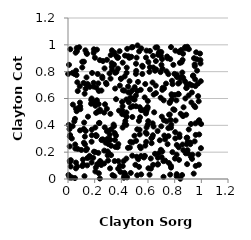
| Category | Series 0 |
|---|---|
| 0.046676937674423886 | 0.784 |
| 0.1731907339990109 | 0.561 |
| 0.23156018715488924 | 0.043 |
| 0.42760766730506783 | 0.92 |
| 0.5336893021140406 | 0.952 |
| 0.09268886672519401 | 0.521 |
| 0.6367927705438385 | 0.326 |
| 0.9290513467448243 | 0.645 |
| 0.5379660975195389 | 0.535 |
| 0.7785230968841657 | 0.594 |
| 0.4707104948257748 | 0.535 |
| 0.7468949703240096 | 0.26 |
| 0.8391897326390824 | 0.866 |
| 0.34968576601538326 | 0.134 |
| 0.6953053178982544 | 0.606 |
| 0.2968760122465636 | 0.205 |
| 0.5696426322543541 | 0.169 |
| 0.6722983463575628 | 0.108 |
| 0.41036892436965217 | 0.867 |
| 0.5864340884211007 | 0.276 |
| 0.4175408332572171 | 0.133 |
| 0.5846683655671804 | 0.905 |
| 0.8909354414835754 | 0.259 |
| 0.013335728364849 | 0.135 |
| 0.11955547361146536 | 0.874 |
| 0.7665870626792595 | 0.033 |
| 0.6250503684640436 | 0.303 |
| 0.1328308287717144 | 0.358 |
| 0.09125341376203373 | 0.542 |
| 0.519206114093471 | 0.37 |
| 0.5092706347199005 | 0.784 |
| 0.2057818210240638 | 0.546 |
| 0.917273317381685 | 0.259 |
| 0.08429098524658475 | 0.982 |
| 0.5367592920172873 | 0.367 |
| 0.37214312046848014 | 0.237 |
| 0.32955264627195086 | 0.959 |
| 0.4754985411567399 | 0.911 |
| 0.6524488144445785 | 0.188 |
| 0.08940384945948819 | 0.57 |
| 0.06554562086051482 | 0.976 |
| 0.7155857116474972 | 0.133 |
| 0.5565957550004644 | 0.844 |
| 0.07018524425496449 | 0.094 |
| 0.7394409686287119 | 0.43 |
| 0.8590399694918804 | 0.257 |
| 0.057574957408292556 | 0.941 |
| 0.1640557005931702 | 0.687 |
| 0.8646857087342421 | 0.472 |
| 0.597121755670744 | 0.537 |
| 0.22286788275097186 | 0.783 |
| 0.8962677892962819 | 0.215 |
| 0.05966879743334477 | 0.123 |
| 0.8829805018857326 | 0.192 |
| 0.4433115345549993 | 0.012 |
| 0.7727190102088954 | 0.085 |
| 0.5390898360487064 | 0.242 |
| 0.877691282450784 | 0.728 |
| 0.06703394839677779 | 0.953 |
| 0.6721994752635393 | 0.357 |
| 0.2846353952011683 | 0.716 |
| 0.3286666740754009 | 0.836 |
| 0.9331424568217861 | 0.181 |
| 0.25059040371349994 | 0.659 |
| 0.16177745395152135 | 0.172 |
| 0.14742301760385748 | 0.708 |
| 0.8595227222581635 | 0.888 |
| 0.3744627109753005 | 0.823 |
| 0.19228619816168752 | 0.94 |
| 0.2237660073145369 | 0.501 |
| 0.5092260927614612 | 0.622 |
| 0.7224204070046648 | 0.324 |
| 0.19194597458374296 | 0.688 |
| 0.2569839202288496 | 0.763 |
| 0.4314366114576344 | 0.475 |
| 0.0547269025426534 | 0.227 |
| 0.509920508866802 | 0.542 |
| 0.9805405721133529 | 0.427 |
| 0.8153659750011059 | 0.036 |
| 0.6747229036105801 | 0.11 |
| 0.4223224963584687 | 0.025 |
| 0.8628799058367227 | 0.933 |
| 0.8327770680637624 | 0.143 |
| 0.6208491824398406 | 0.153 |
| 0.5112553337236531 | 0.284 |
| 0.1950958757126044 | 0.204 |
| 0.3544520413392117 | 0.792 |
| 0.9212706771769078 | 0.167 |
| 0.3020972747949281 | 0.261 |
| 0.8375365185972018 | 0.951 |
| 0.052238632556893504 | 0.007 |
| 0.8130604562920429 | 0.586 |
| 0.9370957154208669 | 0.768 |
| 0.19401418803622206 | 0.967 |
| 0.9499446730407738 | 0.281 |
| 0.9395151472527965 | 0.772 |
| 0.036636022783196574 | 0.554 |
| 0.9255698461596198 | 0.57 |
| 0.7634444239329383 | 0.48 |
| 0.4866858603612687 | 0.542 |
| 0.38935800254068825 | 0.097 |
| 0.4557319380780795 | 0.572 |
| 0.24084133738431882 | 0.134 |
| 0.4056241756335786 | 0.574 |
| 0.7072956053577886 | 0.664 |
| 0.17869045569367317 | 0.326 |
| 0.2168766772427906 | 0.964 |
| 0.4097821111222963 | 0.383 |
| 0.4984210118251923 | 0.322 |
| 0.8934281752644695 | 0.111 |
| 0.7985944220098996 | 0.515 |
| 0.43978977307100736 | 0.463 |
| 0.23875659458211201 | 0.886 |
| 0.5146095974420601 | 0.904 |
| 0.752792451541724 | 0.781 |
| 0.20892436236240533 | 0.327 |
| 0.3156066523986101 | 0.079 |
| 0.8156582640601323 | 0.778 |
| 0.1773685117092146 | 0.123 |
| 0.3931472308274868 | 0.053 |
| 0.01286693904584747 | 0.243 |
| 0.6878301164890219 | 0.949 |
| 0.9302752011022033 | 0.15 |
| 0.597187901010962 | 0.403 |
| 0.32052714300663593 | 0.924 |
| 0.2168477848707807 | 0.587 |
| 0.38875025675613023 | 0.696 |
| 0.01736045135898978 | 0.967 |
| 0.8976954201139312 | 0.277 |
| 0.30467689092527306 | 0.36 |
| 0.9838768596884649 | 0.332 |
| 0.7998085724246662 | 0.626 |
| 0.4377117583783472 | 0.152 |
| 0.20186721276086267 | 0.904 |
| 0.8308493931554167 | 0.236 |
| 0.7084889299643606 | 0.822 |
| 0.6994989402984891 | 0.392 |
| 0.23003936401347205 | 0.558 |
| 0.5799627387163104 | 0.515 |
| 0.589466531291116 | 0.518 |
| 0.9785981418582956 | 0.43 |
| 0.6147685263011925 | 0.667 |
| 0.3828943100506701 | 0.509 |
| 0.23957370365303335 | 0.505 |
| 0.5819730832315049 | 0.347 |
| 0.0471722198335955 | 0.43 |
| 0.9747172168335393 | 0.711 |
| 0.4851650287341322 | 0.273 |
| 0.2090150252280079 | 0.086 |
| 0.29189423171228585 | 0.356 |
| 0.7727391313128991 | 0.383 |
| 0.14242598938925052 | 0.225 |
| 0.942835989518905 | 0.04 |
| 0.5403230809583446 | 0.46 |
| 0.4681067112876465 | 0.277 |
| 0.8515045136892441 | 0.87 |
| 0.6463657964301295 | 0.497 |
| 0.23893202538417474 | 0.004 |
| 0.49045672037080884 | 0.601 |
| 0.3706067786411054 | 0.904 |
| 0.011603717096283836 | 0.011 |
| 0.13044044634643015 | 0.959 |
| 0.7741159163835692 | 0.405 |
| 0.7351591692281364 | 0.711 |
| 0.8995198972721726 | 0.193 |
| 0.2196414838713818 | 0.111 |
| 0.059234877027061233 | 0.525 |
| 0.5572932057896541 | 0.783 |
| 0.9817779440189164 | 0.106 |
| 0.27404348837066406 | 0.824 |
| 0.6528094300983222 | 0.807 |
| 0.11687470963969998 | 0.716 |
| 0.28181051340614854 | 0.271 |
| 0.7568397486729 | 0.119 |
| 0.520176294162281 | 0.656 |
| 0.5795129214809566 | 0.708 |
| 0.021428901937924915 | 0.14 |
| 0.38695176546716287 | 0.953 |
| 0.49946462558968147 | 0.591 |
| 0.6014732816024693 | 0.431 |
| 0.2712519921636725 | 0.495 |
| 0.13853399145398415 | 0.939 |
| 0.8556199636965999 | 0.03 |
| 0.8344403950042217 | 0.946 |
| 0.7901646861157391 | 0.851 |
| 0.752416801457777 | 0.379 |
| 0.16144195128851072 | 0.161 |
| 0.028684990321949867 | 0.302 |
| 0.9681500463335102 | 0.808 |
| 0.5454567520497118 | 0.665 |
| 0.18899549003778846 | 0.157 |
| 0.32327126791351357 | 0.248 |
| 0.5901798876041708 | 0.337 |
| 0.12360925044257637 | 0.021 |
| 0.8941179046650222 | 0.308 |
| 0.8454051927353424 | 0.486 |
| 0.3110599835457872 | 0.294 |
| 0.46474136235282115 | 0.906 |
| 0.7666994723166691 | 0.894 |
| 0.47757962831922895 | 0.981 |
| 0.5964522816426117 | 0.526 |
| 0.3230929309330791 | 0.178 |
| 0.4404803323994665 | 0.83 |
| 0.5375475191852845 | 0.332 |
| 0.33392427875408065 | 0.029 |
| 0.24889701971087067 | 0.104 |
| 0.0010635826426977852 | 0.783 |
| 0.30048827100565284 | 0.137 |
| 0.6770147875417601 | 0.925 |
| 0.3603756276541707 | 0.595 |
| 0.8147388297407242 | 0.021 |
| 0.5250355212838486 | 0.724 |
| 0.584997234121754 | 0.521 |
| 0.7282032309949886 | 0.296 |
| 0.46795644756283933 | 0.607 |
| 0.39663160583756957 | 0.748 |
| 0.004017448057230958 | 0.031 |
| 0.034287747404613475 | 0.791 |
| 0.6318326608256549 | 0.311 |
| 0.6793232202820944 | 0.19 |
| 0.6219023781600583 | 0.078 |
| 0.40665322084471983 | 0.483 |
| 0.4301725525817708 | 0.432 |
| 0.005926100241357826 | 0.403 |
| 0.18058778471610612 | 0.79 |
| 0.4849873381048481 | 0.983 |
| 0.17822526094861293 | 0.368 |
| 0.23142157496354893 | 0.656 |
| 0.1388701952417476 | 0.757 |
| 0.7532573207696533 | 0.32 |
| 0.7839074247458218 | 0.707 |
| 0.6117314428070794 | 0.032 |
| 0.05228154762342658 | 0.448 |
| 0.33103349226327805 | 0.814 |
| 0.27751942156855225 | 0.557 |
| 0.4826434473045821 | 0.462 |
| 0.7292939424367355 | 0.137 |
| 0.7718510145786598 | 0.098 |
| 0.7009824638826786 | 0.851 |
| 0.6997395988194663 | 0.946 |
| 0.5458758141814352 | 0.23 |
| 0.42218435398407644 | 0.659 |
| 0.5326873376344007 | 0.091 |
| 0.20104690119422503 | 0.559 |
| 0.22739539564156597 | 0.194 |
| 0.11404873586985102 | 0.11 |
| 0.6966209705767614 | 0.218 |
| 0.2536996646733097 | 0.294 |
| 0.029349135643793933 | 0.011 |
| 0.4191301906429188 | 0.01 |
| 0.6965018484824774 | 0.918 |
| 0.261613111439334 | 0.295 |
| 0.09031626180511935 | 0.362 |
| 0.8617144096504336 | 0.469 |
| 0.6623028654885308 | 0.816 |
| 0.8047026871852438 | 0.303 |
| 0.5795040314999311 | 0.249 |
| 0.9509197089460705 | 0.841 |
| 0.9116271095676838 | 0.708 |
| 0.7653796191227267 | 0.575 |
| 0.7982351386778459 | 0.783 |
| 0.6567747601375253 | 0.98 |
| 0.7763192005087426 | 0.631 |
| 0.360275278710591 | 0.324 |
| 0.5267040356092753 | 0.147 |
| 0.12472536284638086 | 0.636 |
| 0.3178613780326637 | 0.486 |
| 0.034895528340997774 | 0.393 |
| 0.9541997551984307 | 0.536 |
| 0.26219415900358123 | 0.879 |
| 0.9759566808740957 | 0.618 |
| 0.06406409400634035 | 0.774 |
| 0.702666696735508 | 0.162 |
| 0.06018690966733417 | 0.808 |
| 0.8775115392148062 | 0.983 |
| 0.2753304862945135 | 0.385 |
| 0.17473535762787337 | 0.589 |
| 0.3279488693203214 | 0.864 |
| 0.6143881808407408 | 0.954 |
| 0.3113338534782187 | 0.786 |
| 0.22482096264188062 | 0.11 |
| 0.8650165731351144 | 0.215 |
| 0.5116528102095552 | 0.806 |
| 0.8442961135586228 | 0.749 |
| 0.42586921903577735 | 0.41 |
| 0.14996468605418806 | 0.465 |
| 0.6348286272017003 | 0.415 |
| 0.4999931282567323 | 0.685 |
| 0.05405943608713265 | 0.257 |
| 0.9773985862411543 | 0.183 |
| 0.4707546040542924 | 0.045 |
| 0.5054530087620377 | 0.106 |
| 0.7429478002552824 | 0.913 |
| 0.23562032283682216 | 0.418 |
| 0.547349668052422 | 0.171 |
| 0.6427055654996492 | 0.629 |
| 0.6596077660288989 | 0.64 |
| 0.5489249252545415 | 0.034 |
| 0.5498278083829402 | 0.973 |
| 0.10751676692487913 | 0.096 |
| 0.762517824391527 | 0.567 |
| 0.5099286013655342 | 0.859 |
| 0.35000501313897375 | 0.343 |
| 0.8803495025709801 | 0.6 |
| 0.4296417057332826 | 0.035 |
| 0.17719850614638696 | 0.6 |
| 0.2920733755424991 | 0.888 |
| 0.7462450643580057 | 0.9 |
| 0.602907782331563 | 0.871 |
| 0.9929195489582779 | 0.886 |
| 0.06477872015754783 | 0.505 |
| 0.5893531135583372 | 0.384 |
| 0.4521831901090685 | 0.646 |
| 0.43695466735920246 | 0.403 |
| 0.34800778798052007 | 0.02 |
| 0.5190108359200212 | 0.028 |
| 0.21089338614616993 | 0.493 |
| 0.3535897971083259 | 0.674 |
| 0.9499482972654503 | 0.854 |
| 0.8900513913134721 | 0.307 |
| 0.20531044773496626 | 0.056 |
| 0.06988730031232145 | 0.721 |
| 0.827024461425214 | 0.635 |
| 0.5151721267317756 | 0.166 |
| 0.14492622633513338 | 0.156 |
| 0.2578332420932501 | 0.752 |
| 0.05904667961419439 | 0.08 |
| 0.610637764297836 | 0.799 |
| 0.5751061505551872 | 0.608 |
| 0.6580167238168255 | 0.696 |
| 0.4524635927805768 | 0.915 |
| 0.990369149846694 | 0.935 |
| 0.8425466244286772 | 0.002 |
| 0.4495421552162856 | 0.232 |
| 0.015900933295398826 | 0.328 |
| 0.957961263671676 | 0.329 |
| 0.3973389604751989 | 0.747 |
| 0.6378950347058552 | 0.918 |
| 0.9667757710414732 | 0.892 |
| 0.1213800841724869 | 0.421 |
| 0.0885522296969212 | 0.691 |
| 0.17695083299720848 | 0.278 |
| 0.37722946494891824 | 0.133 |
| 0.46154528586146715 | 0.729 |
| 0.7163863908999234 | 0.016 |
| 0.7204091490595579 | 0.676 |
| 0.3628780821798959 | 0.797 |
| 0.5848214861149837 | 0.488 |
| 0.945118709762319 | 0.9 |
| 0.8016530323521839 | 0.152 |
| 0.7071751713168705 | 0.205 |
| 0.20501177725771602 | 0.384 |
| 0.9834342100472789 | 0.438 |
| 0.351793660552625 | 0.291 |
| 0.7692624707880285 | 0.44 |
| 0.7197517543221705 | 0.438 |
| 0.8160482211995947 | 0.253 |
| 0.7386796991757151 | 0.802 |
| 0.01131254985869165 | 0.371 |
| 0.4640189177873881 | 0.234 |
| 0.8864602373824809 | 0.479 |
| 0.6688771296491367 | 0.981 |
| 0.7099371441382194 | 0.68 |
| 0.9577844659695542 | 0.097 |
| 0.4824444248860417 | 0.661 |
| 0.560051431718217 | 0.837 |
| 0.0733326902855516 | 0.224 |
| 0.0729282425018432 | 0.656 |
| 0.914639213226625 | 0.272 |
| 0.7582573063526906 | 0.479 |
| 0.817294212596679 | 0.76 |
| 0.5215242595917049 | 0.996 |
| 0.9057558737165539 | 0.369 |
| 0.31306145721162937 | 0.331 |
| 0.4880793085549877 | 0.597 |
| 0.20477014177567027 | 0.2 |
| 0.2084721523131198 | 0.58 |
| 0.7726117846574002 | 0.983 |
| 0.22727546776773266 | 0.713 |
| 0.013736217169282347 | 0.317 |
| 0.6807876227893973 | 0.939 |
| 0.43844322872972913 | 0.496 |
| 0.1263784011054417 | 0.316 |
| 0.2130831507313603 | 0.681 |
| 0.9969850894983238 | 0.23 |
| 0.9051153431127194 | 0.623 |
| 0.8866396800112862 | 0.678 |
| 0.6738144842029629 | 0.158 |
| 0.14237165835493618 | 0.932 |
| 0.8054398134099673 | 0.956 |
| 0.8268740951494604 | 0.711 |
| 0.3553849862873231 | 0.239 |
| 0.6885416956836965 | 0.289 |
| 0.5887692642433846 | 0.957 |
| 0.4680082834914421 | 0.645 |
| 0.291620661692459 | 0.523 |
| 0.4504296442553802 | 0.689 |
| 0.4235039693484443 | 0.046 |
| 0.014502209180590671 | 0.127 |
| 0.8068924064484292 | 0.436 |
| 0.28896192931179143 | 0.706 |
| 0.3760376444659641 | 0.905 |
| 0.8037669939467939 | 0.349 |
| 0.8491277289171141 | 0.962 |
| 0.4074433069660559 | 0.511 |
| 0.5476679919790673 | 0.513 |
| 0.9223575799900378 | 0.41 |
| 0.6339496376838221 | 0.719 |
| 0.7895772712345045 | 0.519 |
| 0.0073682798715560835 | 0.851 |
| 0.11177156094417802 | 0.145 |
| 0.6941883951354908 | 0.797 |
| 0.3178691684323005 | 0.292 |
| 0.29427532823703834 | 0.298 |
| 0.8665931970179298 | 0.534 |
| 0.9957845530235843 | 0.729 |
| 0.2321842783138936 | 0.416 |
| 0.9448269075835343 | 0.547 |
| 0.6591246140997019 | 0.879 |
| 0.4440453885580857 | 0.97 |
| 0.4249046339863435 | 0.764 |
| 0.021047927732604332 | 0.012 |
| 0.1407439789725133 | 0.702 |
| 0.5592948711447782 | 0.513 |
| 0.09979321074192071 | 0.217 |
| 0.12725986349199214 | 0.259 |
| 0.6031046184695127 | 0.08 |
| 0.239890030508761 | 0.516 |
| 0.4580795722123372 | 0.904 |
| 0.43952468403163913 | 0.792 |
| 0.1320184762354557 | 0.672 |
| 0.37739381307627096 | 0.26 |
| 0.8641691870170831 | 0.754 |
| 0.21238189883054734 | 0.32 |
| 0.7787356329675972 | 0.625 |
| 0.34539305985665936 | 0.393 |
| 0.8572487527551992 | 0.794 |
| 0.8355351632370608 | 0.333 |
| 0.11854171949387114 | 0.373 |
| 0.9983595637995429 | 0.41 |
| 0.10712872624642594 | 0.874 |
| 0.3450268428644252 | 0.853 |
| 0.9553515733923481 | 0.693 |
| 0.9802293740157771 | 0.579 |
| 0.14389767309145657 | 0.101 |
| 0.8300500753888632 | 0.631 |
| 0.9937197946796977 | 0.861 |
| 0.11918515435954471 | 0.27 |
| 0.8367460009961701 | 0.313 |
| 0.37639336459731787 | 0.077 |
| 0.4821943390059885 | 0.174 |
| 0.18837992829220385 | 0.567 |
| 0.01322214938965575 | 0.016 |
| 0.08575674152579905 | 0.532 |
| 0.7051792200300068 | 0.893 |
| 0.21435061862010035 | 0.323 |
| 0.8517125389336334 | 0.763 |
| 0.4093336191357683 | 0.542 |
| 0.5877415547859629 | 0.504 |
| 0.7799395880866352 | 0.732 |
| 0.8832035980113807 | 0.974 |
| 0.6383708210354998 | 0.106 |
| 0.7834557778317598 | 0.2 |
| 0.25113746496731176 | 0.29 |
| 0.13484702916570515 | 0.215 |
| 0.569363160010475 | 0.16 |
| 0.9613205594875824 | 0.944 |
| 0.41192651871370467 | 0.661 |
| 0.8909954591692096 | 0.705 |
| 0.27216475657484696 | 0.211 |
| 0.30483965440226085 | 0.192 |
| 0.32573122349129563 | 0.371 |
| 0.4378301841881923 | 0.593 |
| 0.8948172784130509 | 0.985 |
| 0.19206636683643993 | 0.717 |
| 0.3192078632978032 | 0.748 |
| 0.8149757212156591 | 0.181 |
| 0.8918219632637219 | 0.682 |
| 0.531831426468567 | 0.433 |
| 0.10711741238548667 | 0.831 |
| 0.020121882544743327 | 0.093 |
| 0.5767958426044177 | 0.172 |
| 0.9561467307828785 | 0.415 |
| 0.2707869686305772 | 0.115 |
| 0.953980418301124 | 0.743 |
| 0.9294904942453207 | 0.698 |
| 0.8359218522264941 | 0.719 |
| 0.7178407115800389 | 0.586 |
| 0.641645185249537 | 0.391 |
| 0.5984196530813781 | 0.581 |
| 0.6402602953217132 | 0.831 |
| 0.7035035428348062 | 0.465 |
| 0.6142129476079128 | 0.834 |
| 0.29754501940942396 | 0.176 |
| 0.6269310440109518 | 0.267 |
| 0.3599466974670619 | 0.919 |
| 0.34183952123713585 | 0.406 |
| 0.3475471836387128 | 0.942 |
| 0.9065237314413043 | 0.968 |
| 0.41069421555246544 | 0.096 |